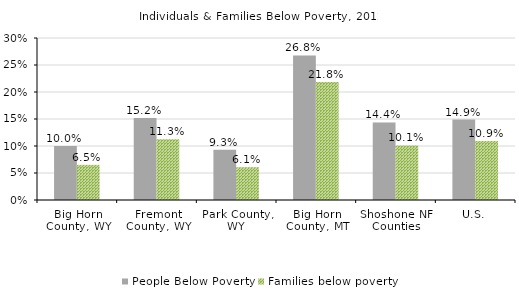
| Category | People Below Poverty | Families below poverty |
|---|---|---|
| Gallatin County, MT | 0.133 | 0.069 |
| County Region | 0.133 | 0.069 |
| U.S. | 0.149 | 0.109 |